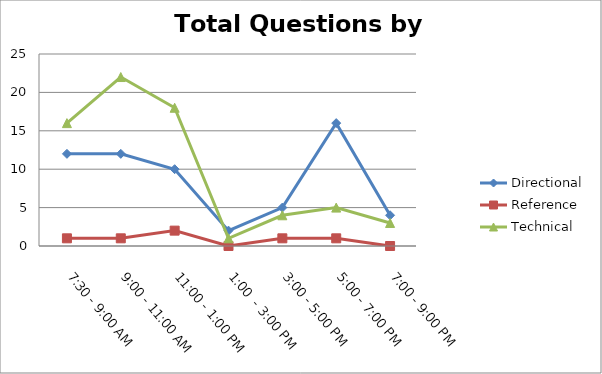
| Category | Directional | Reference | Technical |
|---|---|---|---|
| 7:30 - 9:00 AM | 12 | 1 | 16 |
| 9:00 - 11:00 AM | 12 | 1 | 22 |
| 11:00 - 1:00 PM | 10 | 2 | 18 |
| 1:00  - 3:00 PM | 2 | 0 | 1 |
| 3:00 - 5:00 PM | 5 | 1 | 4 |
| 5:00 - 7:00 PM | 16 | 1 | 5 |
| 7:00 - 9:00 PM | 4 | 0 | 3 |